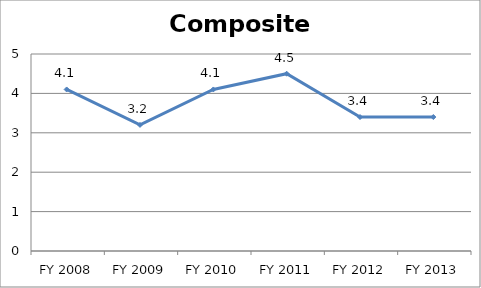
| Category | Composite score |
|---|---|
| FY 2013 | 3.4 |
| FY 2012 | 3.4 |
| FY 2011 | 4.5 |
| FY 2010 | 4.1 |
| FY 2009 | 3.2 |
| FY 2008 | 4.1 |